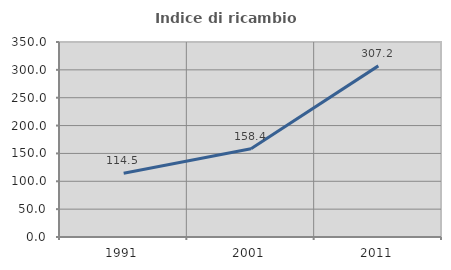
| Category | Indice di ricambio occupazionale  |
|---|---|
| 1991.0 | 114.486 |
| 2001.0 | 158.424 |
| 2011.0 | 307.155 |